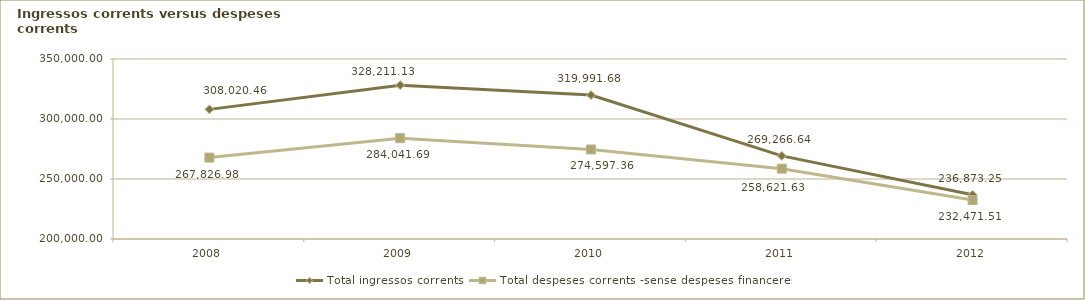
| Category | Total ingressos corrents  | Total despeses corrents -sense despeses financeres- |
|---|---|---|
| 2008.0 | 308020.464 | 267826.984 |
| 2009.0 | 328211.13 | 284041.688 |
| 2010.0 | 319991.684 | 274597.357 |
| 2011.0 | 269266.636 | 258621.626 |
| 2012.0 | 236873.251 | 232471.513 |